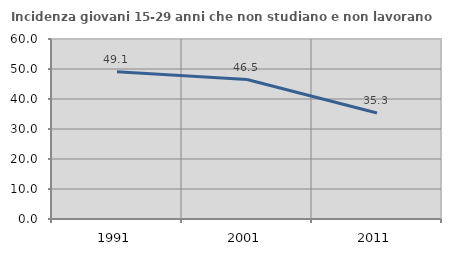
| Category | Incidenza giovani 15-29 anni che non studiano e non lavorano  |
|---|---|
| 1991.0 | 49.117 |
| 2001.0 | 46.496 |
| 2011.0 | 35.337 |